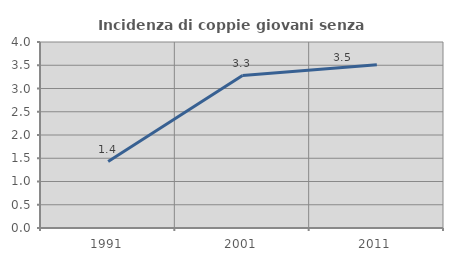
| Category | Incidenza di coppie giovani senza figli |
|---|---|
| 1991.0 | 1.429 |
| 2001.0 | 3.279 |
| 2011.0 | 3.509 |